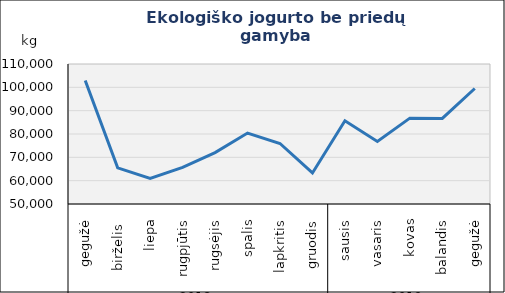
| Category | Jogurtas be priedų |
|---|---|
| 0 | 102902 |
| 1 | 65485 |
| 2 | 60967 |
| 3 | 65692 |
| 4 | 72041 |
| 5 | 80421 |
| 6 | 75933 |
| 7 | 63294 |
| 8 | 85686 |
| 9 | 76773 |
| 10 | 86793 |
| 11 | 86670 |
| 12 | 99501 |